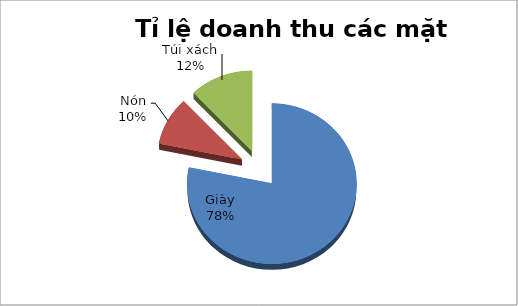
| Category | Series 0 |
|---|---|
| Giày | 2622 |
| Nón | 326.34 |
| Túi xách | 405.46 |